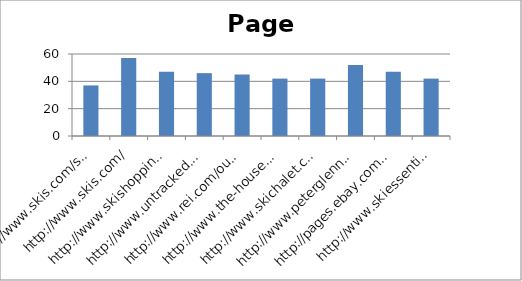
| Category | Page Authority |
|---|---|
| http://www.skis.com/ski-equipment/c9/ | 37 |
| http://www.skis.com/ | 57 |
| http://www.skishoppingguide.com/ | 47 |
| http://www.untracked.com/ | 46 |
| http://www.rei.com/outlet/category/22000078 | 45 |
| http://www.the-house.com/skis.html | 42 |
| http://www.skichalet.com/ | 42 |
| http://www.peterglenn.com/ | 52 |
| http://pages.ebay.com/buy/guides/skis-skiing-equipment-buying-guide/ | 47 |
| http://www.skiessentials.com/ | 42 |